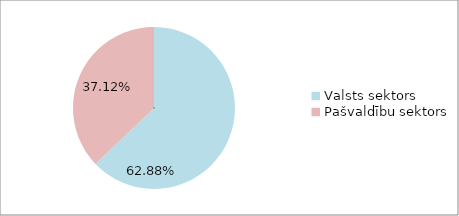
| Category | Series 0 |
|---|---|
| Valsts sektors | 0.629 |
| Pašvaldību sektors | 0.371 |